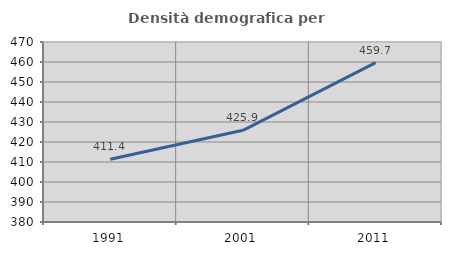
| Category | Densità demografica |
|---|---|
| 1991.0 | 411.387 |
| 2001.0 | 425.855 |
| 2011.0 | 459.729 |